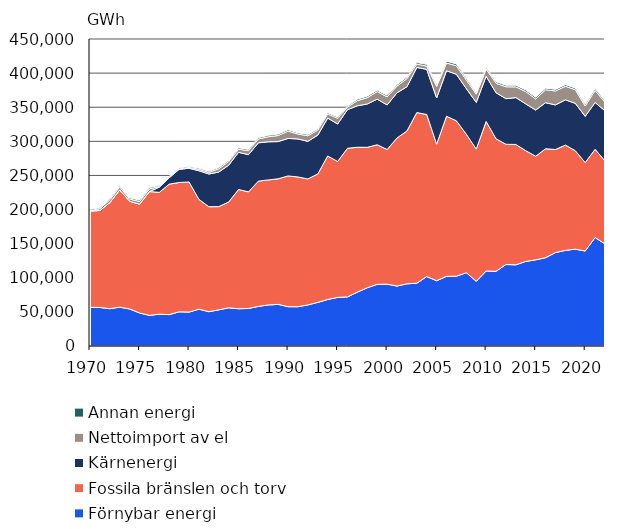
| Category | Förnybar energi | Fossila bränslen och torv | Kärnenergi | Nettoimport av el | Annan energi |
|---|---|---|---|---|---|
| 1970.0 | 56676 | 141251 | 0 | 528 | 1672 |
| 1971.0 | 56498 | 142144 | 0 | 2590 | 1481 |
| 1972.0 | 54693 | 155524 | 0 | 4219 | 1732 |
| 1973.0 | 56869 | 171987 | 0 | 4319 | 1864 |
| 1974.0 | 54304 | 157985 | 0 | 3140 | 1771 |
| 1975.0 | 48406 | 159489 | 0 | 3987 | 1947 |
| 1976.0 | 44933 | 181379 | 0 | 4015 | 1918 |
| 1977.0 | 46592 | 178632 | 7606 | 891 | 1394 |
| 1978.0 | 46012 | 191245 | 9330 | 1277 | 1045 |
| 1979.0 | 50085 | 189606 | 19273 | 649 | 1335 |
| 1980.0 | 49695 | 190761 | 20076 | 1211 | 1275 |
| 1981.0 | 53974 | 160985 | 41924 | 2244 | 1590 |
| 1982.0 | 50311 | 153835 | 47958 | 2314 | 1710 |
| 1983.0 | 52962 | 151337 | 50658 | 4778 | 1765 |
| 1984.0 | 55959 | 155126 | 53936 | 5215 | 1846 |
| 1985.0 | 54617 | 174764 | 54485 | 4727 | 1919 |
| 1986.0 | 54979 | 170952 | 54539 | 5807 | 1892 |
| 1987.0 | 58048 | 183616 | 56164 | 5595 | 1883 |
| 1988.0 | 60156 | 183302 | 55900 | 7385 | 1999 |
| 1989.0 | 60992 | 184085 | 54576 | 8868 | 2055 |
| 1990.0 | 57617 | 191694 | 54933 | 10742 | 2057 |
| 1991.0 | 57566 | 190200 | 55779 | 7184 | 1692 |
| 1992.0 | 60175 | 184734 | 55061 | 8231 | 1909 |
| 1993.0 | 63942 | 188209 | 56970 | 7537 | 1711 |
| 1994.0 | 68181 | 210368 | 55539 | 6078 | 1820 |
| 1995.0 | 71238 | 199267 | 54933 | 8405 | 1884 |
| 1996.0 | 72002 | 217855 | 56603 | 3661 | 1721 |
| 1997.0 | 78965 | 212347 | 60761 | 7653 | 1964 |
| 1998.0 | 85411 | 205799 | 63564 | 9306 | 2173 |
| 1999.0 | 90364 | 204632 | 66849 | 11124 | 2089 |
| 2000.0 | 90620 | 197370 | 65379 | 11880 | 2133 |
| 2001.0 | 87854 | 217064 | 66224 | 9959 | 2156 |
| 2002.0 | 91160 | 224039 | 64833 | 11925 | 2221 |
| 2003.0 | 92032 | 250126 | 66151 | 4852 | 2313 |
| 2004.0 | 101779 | 237647 | 66103 | 4870 | 2440 |
| 2005.0 | 95675 | 200194 | 67746 | 17014 | 2579 |
| 2006.0 | 102102 | 234705 | 66678 | 11401 | 2556 |
| 2007.0 | 102303 | 227733 | 68185 | 12557 | 2612 |
| 2008.0 | 107452 | 202932 | 66817 | 12772 | 2576 |
| 2009.0 | 94870 | 193769 | 68487 | 12085 | 1982 |
| 2010.0 | 109949 | 219162 | 66330 | 10501 | 2363 |
| 2011.0 | 109545 | 194207 | 67471 | 13851 | 2177 |
| 2012.0 | 119433 | 176261 | 66857 | 17443 | 2115 |
| 2013.0 | 119004 | 176416 | 68708 | 15715 | 2308 |
| 2014.0 | 123929 | 162325 | 68624 | 17966 | 2326 |
| 2015.0 | 126289 | 151905 | 67654 | 16337 | 2296 |
| 2016.0 | 129440 | 159676 | 67516 | 18951 | 2291 |
| 2017.0 | 136936 | 151087 | 65376 | 20426 | 2302 |
| 2018.0 | 140140 | 154359 | 66306 | 19936 | 2365 |
| 2019.0 | 141946 | 144353 | 69439 | 20042 | 2285 |
| 2020.0 | 139186 | 129730 | 67740 | 15105 | 2609 |
| 2021.0 | 158950 | 129345 | 68624 | 17768 | 2582 |
| 2022.0 | 149614 | 121641 | 73461 | 12518 | 2281 |